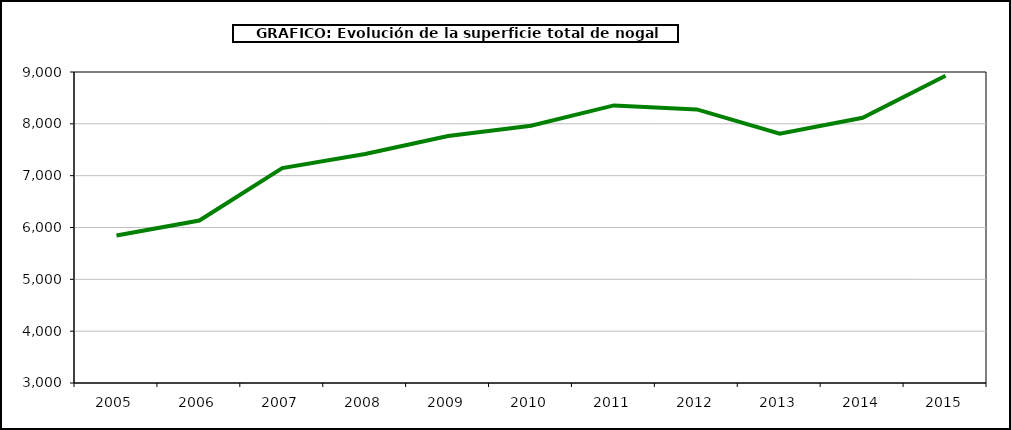
| Category | superficie nogal |
|---|---|
| 2005.0 | 5846 |
| 2006.0 | 6134 |
| 2007.0 | 7147 |
| 2008.0 | 7418 |
| 2009.0 | 7765 |
| 2010.0 | 7962 |
| 2011.0 | 8355 |
| 2012.0 | 8278 |
| 2013.0 | 7811 |
| 2014.0 | 8116 |
| 2015.0 | 8926 |